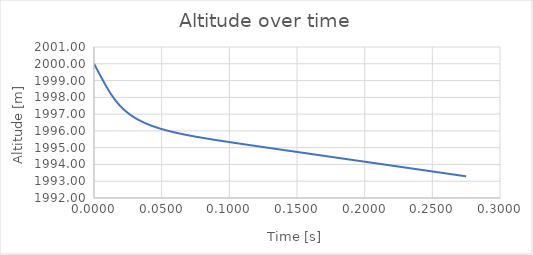
| Category | Series 0 |
|---|---|
| 0.0 | 2000 |
| 0.0025 | 1999.625 |
| 0.005 | 1999.25 |
| 0.0075 | 1998.88 |
| 0.01 | 1998.525 |
| 0.0125 | 1998.198 |
| 0.015000000000000001 | 1997.909 |
| 0.0175 | 1997.656 |
| 0.02 | 1997.435 |
| 0.0225 | 1997.242 |
| 0.024999999999999998 | 1997.072 |
| 0.027499999999999997 | 1996.923 |
| 0.029999999999999995 | 1996.791 |
| 0.032499999999999994 | 1996.674 |
| 0.034999999999999996 | 1996.568 |
| 0.0375 | 1996.473 |
| 0.04 | 1996.387 |
| 0.0425 | 1996.309 |
| 0.045000000000000005 | 1996.237 |
| 0.04750000000000001 | 1996.171 |
| 0.05000000000000001 | 1996.109 |
| 0.05250000000000001 | 1996.052 |
| 0.055000000000000014 | 1995.999 |
| 0.057500000000000016 | 1995.948 |
| 0.06000000000000002 | 1995.901 |
| 0.06250000000000001 | 1995.856 |
| 0.06500000000000002 | 1995.813 |
| 0.06750000000000002 | 1995.772 |
| 0.07000000000000002 | 1995.733 |
| 0.07250000000000002 | 1995.695 |
| 0.07500000000000002 | 1995.658 |
| 0.07750000000000003 | 1995.623 |
| 0.08000000000000003 | 1995.588 |
| 0.08250000000000003 | 1995.554 |
| 0.08500000000000003 | 1995.521 |
| 0.08750000000000004 | 1995.489 |
| 0.09000000000000004 | 1995.457 |
| 0.09250000000000004 | 1995.425 |
| 0.09500000000000004 | 1995.394 |
| 0.09750000000000004 | 1995.363 |
| 0.10000000000000005 | 1995.333 |
| 0.10250000000000005 | 1995.303 |
| 0.10500000000000005 | 1995.273 |
| 0.10750000000000005 | 1995.243 |
| 0.11000000000000006 | 1995.213 |
| 0.11250000000000006 | 1995.183 |
| 0.11500000000000006 | 1995.154 |
| 0.11750000000000006 | 1995.125 |
| 0.12000000000000006 | 1995.095 |
| 0.12250000000000007 | 1995.066 |
| 0.12500000000000006 | 1995.037 |
| 0.12750000000000006 | 1995.007 |
| 0.13000000000000006 | 1994.978 |
| 0.13250000000000006 | 1994.949 |
| 0.13500000000000006 | 1994.92 |
| 0.13750000000000007 | 1994.891 |
| 0.14000000000000007 | 1994.862 |
| 0.14250000000000007 | 1994.833 |
| 0.14500000000000007 | 1994.804 |
| 0.14750000000000008 | 1994.774 |
| 0.15000000000000008 | 1994.745 |
| 0.15250000000000008 | 1994.716 |
| 0.15500000000000008 | 1994.687 |
| 0.15750000000000008 | 1994.658 |
| 0.1600000000000001 | 1994.629 |
| 0.1625000000000001 | 1994.6 |
| 0.1650000000000001 | 1994.571 |
| 0.1675000000000001 | 1994.542 |
| 0.1700000000000001 | 1994.513 |
| 0.1725000000000001 | 1994.484 |
| 0.1750000000000001 | 1994.455 |
| 0.1775000000000001 | 1994.426 |
| 0.1800000000000001 | 1994.397 |
| 0.1825000000000001 | 1994.367 |
| 0.1850000000000001 | 1994.338 |
| 0.1875000000000001 | 1994.309 |
| 0.1900000000000001 | 1994.28 |
| 0.19250000000000012 | 1994.251 |
| 0.19500000000000012 | 1994.222 |
| 0.19750000000000012 | 1994.193 |
| 0.20000000000000012 | 1994.164 |
| 0.20250000000000012 | 1994.135 |
| 0.20500000000000013 | 1994.106 |
| 0.20750000000000013 | 1994.077 |
| 0.21000000000000013 | 1994.048 |
| 0.21250000000000013 | 1994.019 |
| 0.21500000000000014 | 1993.99 |
| 0.21750000000000014 | 1993.96 |
| 0.22000000000000014 | 1993.931 |
| 0.22250000000000014 | 1993.902 |
| 0.22500000000000014 | 1993.873 |
| 0.22750000000000015 | 1993.844 |
| 0.23000000000000015 | 1993.815 |
| 0.23250000000000015 | 1993.786 |
| 0.23500000000000015 | 1993.757 |
| 0.23750000000000016 | 1993.728 |
| 0.24000000000000016 | 1993.699 |
| 0.24250000000000016 | 1993.67 |
| 0.24500000000000016 | 1993.641 |
| 0.24750000000000016 | 1993.612 |
| 0.25000000000000017 | 1993.583 |
| 0.25250000000000017 | 1993.554 |
| 0.25500000000000017 | 1993.524 |
| 0.2575000000000002 | 1993.495 |
| 0.2600000000000002 | 1993.466 |
| 0.2625000000000002 | 1993.437 |
| 0.2650000000000002 | 1993.408 |
| 0.2675000000000002 | 1993.379 |
| 0.2700000000000002 | 1993.35 |
| 0.2725000000000002 | 1993.321 |
| 0.2750000000000002 | 1993.292 |